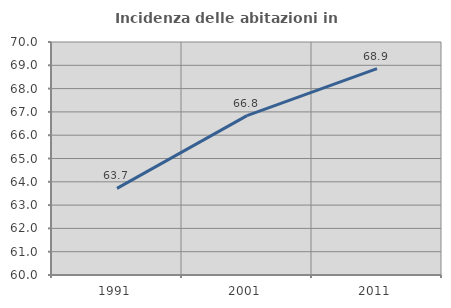
| Category | Incidenza delle abitazioni in proprietà  |
|---|---|
| 1991.0 | 63.719 |
| 2001.0 | 66.84 |
| 2011.0 | 68.854 |